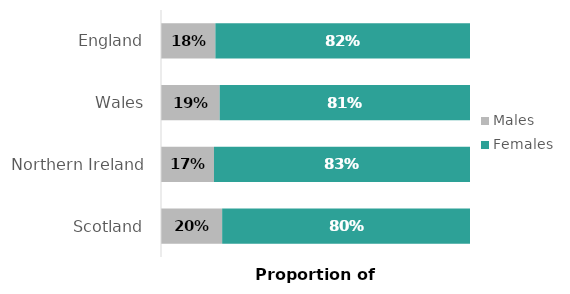
| Category | Males | Females |
|---|---|---|
| Scotland | 0.198 | 0.802 |
| Northern Ireland | 0.171 | 0.829 |
| Wales | 0.19 | 0.81 |
| England | 0.176 | 0.824 |